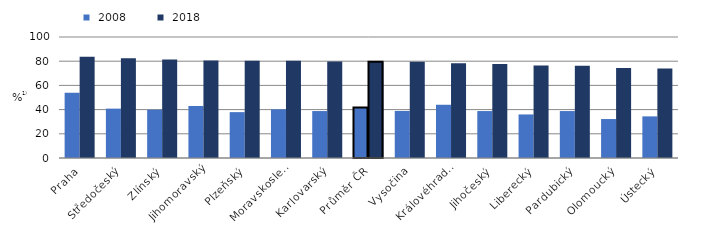
| Category |  2008 |  2018 |
|---|---|---|
|   Praha | 54 | 83.6 |
|   Středočeský | 40.8 | 82.4 |
|   Zlínský | 39.9 | 81.4 |
|   Jihomoravský | 43 | 80.6 |
|   Plzeňský | 37.9 | 80.4 |
|   Moravskoslezský | 40.2 | 80.4 |
|   Karlovarský | 38.8 | 79.7 |
| Průměr ČR | 41.7 | 79.6 |
|   Vysočina | 38.9 | 79.5 |
|   Královéhradecký | 44 | 78.3 |
|   Jihočeský | 38.8 | 77.6 |
|   Liberecký | 36 | 76.5 |
|   Pardubický | 38.8 | 76.3 |
|   Olomoucký | 32.2 | 74.4 |
|   Ústecký | 34.4 | 73.9 |